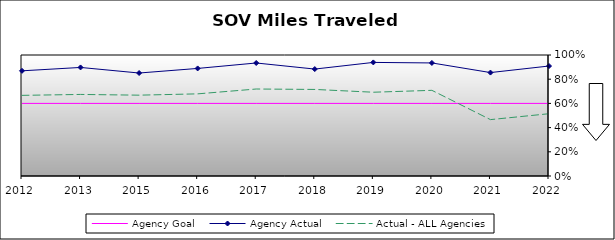
| Category | Agency Goal | Agency Actual | Actual - ALL Agencies |
|---|---|---|---|
| 2012.0 | 0.6 | 0.869 | 0.666 |
| 2013.0 | 0.6 | 0.897 | 0.674 |
| 2015.0 | 0.6 | 0.851 | 0.668 |
| 2016.0 | 0.6 | 0.889 | 0.679 |
| 2017.0 | 0.6 | 0.934 | 0.719 |
| 2018.0 | 0.6 | 0.884 | 0.715 |
| 2019.0 | 0.6 | 0.939 | 0.692 |
| 2020.0 | 0.6 | 0.934 | 0.708 |
| 2021.0 | 0.6 | 0.855 | 0.466 |
| 2022.0 | 0.6 | 0.909 | 0.515 |